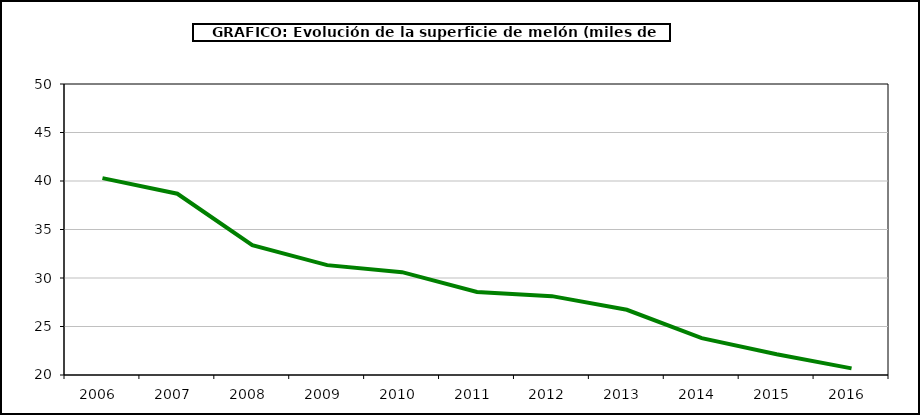
| Category | superficie |
|---|---|
| 2006.0 | 40.294 |
| 2007.0 | 38.688 |
| 2008.0 | 33.388 |
| 2009.0 | 31.327 |
| 2010.0 | 30.601 |
| 2011.0 | 28.561 |
| 2012.0 | 28.13 |
| 2013.0 | 26.723 |
| 2014.0 | 23.8 |
| 2015.0 | 22.144 |
| 2016.0 | 20.686 |